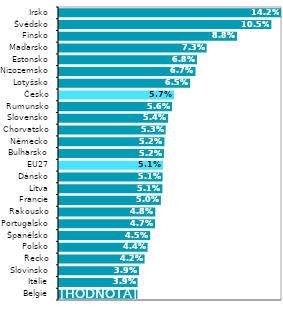
| Category | Series 0 |
|---|---|
| Belgie | 0.039 |
| Itálie | 0.039 |
| Slovinsko | 0.039 |
| Řecko | 0.042 |
| Polsko | 0.044 |
| Španělsko | 0.045 |
| Portugalsko | 0.047 |
| Rakousko | 0.048 |
| Francie | 0.05 |
| Litva | 0.051 |
| Dánsko | 0.051 |
| EU27 | 0.051 |
| Bulharsko | 0.052 |
| Německo | 0.052 |
| Chorvatsko | 0.053 |
| Slovensko | 0.054 |
| Rumunsko | 0.056 |
| Česko | 0.057 |
| Lotyšsko | 0.065 |
| Nizozemsko | 0.067 |
| Estonsko | 0.068 |
| Maďarsko | 0.073 |
| Finsko | 0.088 |
| Švédsko | 0.105 |
| Irsko | 0.142 |